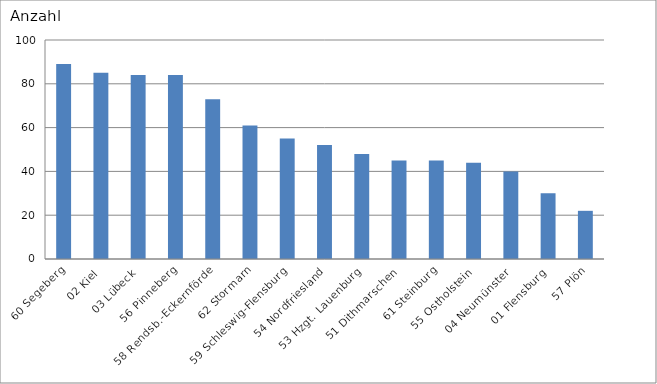
| Category | 60 Segeberg |
|---|---|
| 60 Segeberg | 89 |
| 02 Kiel | 85 |
| 03 Lübeck | 84 |
| 56 Pinneberg | 84 |
| 58 Rendsb.-Eckernförde | 73 |
| 62 Stormarn | 61 |
| 59 Schleswig-Flensburg | 55 |
| 54 Nordfriesland | 52 |
| 53 Hzgt. Lauenburg | 48 |
| 51 Dithmarschen | 45 |
| 61 Steinburg | 45 |
| 55 Ostholstein | 44 |
| 04 Neumünster | 40 |
| 01 Flensburg | 30 |
| 57 Plön | 22 |